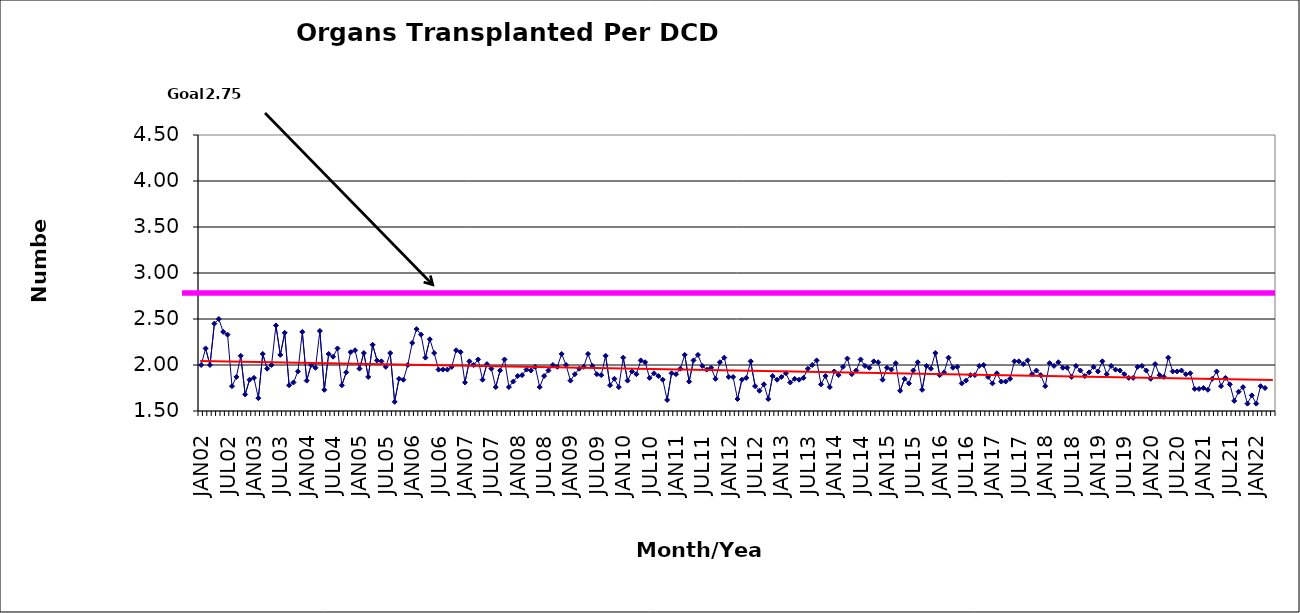
| Category | Series 0 |
|---|---|
| JAN02 | 2 |
| FEB02 | 2.18 |
| MAR02 | 2 |
| APR02 | 2.45 |
| MAY02 | 2.5 |
| JUN02 | 2.36 |
| JUL02 | 2.33 |
| AUG02 | 1.77 |
| SEP02 | 1.87 |
| OCT02 | 2.1 |
| NOV02 | 1.68 |
| DEC02 | 1.84 |
| JAN03 | 1.86 |
| FEB03 | 1.64 |
| MAR03 | 2.12 |
| APR03 | 1.96 |
| MAY03 | 2 |
| JUN03 | 2.43 |
| JUL03 | 2.11 |
| AUG03 | 2.35 |
| SEP03 | 1.78 |
| OCT03 | 1.81 |
| NOV03 | 1.93 |
| DEC03 | 2.36 |
| JAN04 | 1.83 |
| FEB04 | 2 |
| MAR04 | 1.97 |
| APR04 | 2.37 |
| MAY04 | 1.73 |
| JUN04 | 2.12 |
| JUL04 | 2.09 |
| AUG04 | 2.18 |
| SEP04 | 1.78 |
| OCT04 | 1.92 |
| NOV04 | 2.14 |
| DEC04 | 2.16 |
| JAN05 | 1.96 |
| FEB05 | 2.13 |
| MAR05 | 1.87 |
| APR05 | 2.22 |
| MAY05 | 2.05 |
| JUN05 | 2.04 |
| JUL05 | 1.98 |
| AUG05 | 2.13 |
| SEP05 | 1.6 |
| OCT05 | 1.85 |
| NOV05 | 1.84 |
| DEC05 | 2 |
| JAN06 | 2.24 |
| FEB06 | 2.39 |
| MAR06 | 2.33 |
| APR06 | 2.08 |
| MAY06 | 2.28 |
| JUN06 | 2.13 |
| JUL06 | 1.95 |
| AUG06 | 1.95 |
| SEP06 | 1.95 |
| OCT06 | 1.98 |
| NOV06 | 2.16 |
| DEC06 | 2.14 |
| JAN07 | 1.81 |
| FEB07 | 2.04 |
| MAR07 | 2 |
| APR07 | 2.06 |
| MAY07 | 1.84 |
| JUN07 | 2.01 |
| JUL07 | 1.96 |
| AUG07 | 1.76 |
| SEP07 | 1.94 |
| OCT07 | 2.06 |
| NOV07 | 1.76 |
| DEC07 | 1.82 |
| JAN08 | 1.88 |
| FEB08 | 1.89 |
| MAR08 | 1.95 |
| APR08 | 1.94 |
| MAY08 | 1.98 |
| JUN08 | 1.76 |
| JUL08 | 1.88 |
| AUG08 | 1.94 |
| SEP08 | 2 |
| OCT08 | 1.98 |
| NOV08 | 2.12 |
| DEC08 | 2 |
| JAN09 | 1.83 |
| FEB09 | 1.9 |
| MAR09 | 1.96 |
| APR09 | 1.98 |
| MAY09 | 2.12 |
| JUN09 | 1.99 |
| JUL09 | 1.9 |
| AUG09 | 1.89 |
| SEP09 | 2.1 |
| OCT09 | 1.78 |
| NOV09 | 1.85 |
| DEC09 | 1.76 |
| JAN10 | 2.08 |
| FEB10 | 1.83 |
| MAR10 | 1.93 |
| APR10 | 1.9 |
| MAY10 | 2.05 |
| JUN10 | 2.03 |
| JUL10 | 1.86 |
| AUG10 | 1.91 |
| SEP10 | 1.88 |
| OCT10 | 1.84 |
| NOV10 | 1.62 |
| DEC10 | 1.91 |
| JAN11 | 1.9 |
| FEB11 | 1.96 |
| MAR11 | 2.11 |
| APR11 | 1.82 |
| MAY11 | 2.05 |
| JUN11 | 2.11 |
| JUL11 | 1.99 |
| AUG11 | 1.95 |
| SEP11 | 1.97 |
| OCT11 | 1.85 |
| NOV11 | 2.03 |
| DEC11 | 2.08 |
| JAN12 | 1.87 |
| FEB12 | 1.87 |
| MAR12 | 1.63 |
| APR12 | 1.84 |
| MAY12 | 1.86 |
| JUN12 | 2.04 |
| JUL12 | 1.77 |
| AUG12 | 1.72 |
| SEP12 | 1.79 |
| OCT12 | 1.63 |
| NOV12 | 1.88 |
| DEC12 | 1.84 |
| JAN13 | 1.87 |
| FEB13 | 1.91 |
| MAR13 | 1.81 |
| APR13 | 1.85 |
| MAY13 | 1.84 |
| JUN13 | 1.86 |
| JUL13 | 1.96 |
| AUG13 | 2 |
| SEP13 | 2.05 |
| OCT13 | 1.79 |
| NOV13 | 1.88 |
| DEC13 | 1.76 |
| JAN14 | 1.93 |
| FEB14 | 1.89 |
| MAR14 | 1.98 |
| APR14 | 2.07 |
| MAY14 | 1.9 |
| JUN14 | 1.94 |
| JUL14 | 2.06 |
| AUG14 | 1.99 |
| SEP14 | 1.97 |
| OCT14 | 2.04 |
| NOV14 | 2.03 |
| DEC14 | 1.84 |
| JAN15 | 1.97 |
| FEB15 | 1.95 |
| MAR15 | 2.02 |
| APR15 | 1.72 |
| MAY15 | 1.85 |
| JUN15 | 1.8 |
| JUL15 | 1.94 |
| AUG15 | 2.03 |
| SEP15 | 1.73 |
| OCT15 | 1.99 |
| NOV15 | 1.96 |
| DEC15 | 2.13 |
| JAN16 | 1.89 |
| FEB16 | 1.92 |
| MAR16 | 2.08 |
| APR16 | 1.97 |
| MAY16 | 1.98 |
| JUN16 | 1.8 |
| JUL16 | 1.83 |
| AUG16 | 1.89 |
| SEP16 | 1.89 |
| OCT16 | 1.99 |
| NOV16 | 2 |
| DEC16 | 1.87 |
| JAN17 | 1.8 |
| FEB17 | 1.91 |
| MAR17 | 1.82 |
| APR17 | 1.82 |
| MAY17 | 1.85 |
| JUN17 | 2.04 |
| JUL17 | 2.04 |
| AUG17 | 2.01 |
| SEP17 | 2.05 |
| OCT17 | 1.9 |
| NOV17 | 1.94 |
| DEC17 | 1.89 |
| JAN18 | 1.77 |
| FEB18 | 2.02 |
| MAR18 | 1.99 |
| APR18 | 2.03 |
| MAY18 | 1.97 |
| JUN18 | 1.97 |
| JUL18 | 1.87 |
| AUG18 | 1.99 |
| SEP18 | 1.94 |
| OCT18 | 1.88 |
| NOV18 | 1.92 |
| DEC18 | 1.98 |
| JAN19 | 1.93 |
| FEB19 | 2.04 |
| MAR19 | 1.9 |
| APR19 | 1.99 |
| MAY19 | 1.95 |
| JUN19 | 1.94 |
| JUL19 | 1.9 |
| AUG19 | 1.86 |
| SEP19 | 1.86 |
| OCT19 | 1.98 |
| NOV19 | 1.99 |
| DEC19 | 1.94 |
| JAN20 | 1.85 |
| FEB20 | 2.01 |
| MAR20 | 1.89 |
| APR20 | 1.87 |
| MAY20 | 2.08 |
| JUN20 | 1.93 |
| JUL20 | 1.93 |
| AUG20 | 1.94 |
| SEP20 | 1.9 |
| OCT20 | 1.91 |
| NOV20 | 1.74 |
| DEC20 | 1.74 |
| JAN21 | 1.75 |
| FEB21 | 1.73 |
| MAR21 | 1.85 |
| APR21 | 1.93 |
| MAY21 | 1.77 |
| JUN21 | 1.86 |
| JUL21 | 1.79 |
| AUG21 | 1.61 |
| SEP21 | 1.71 |
| OCT21 | 1.76 |
| NOV21 | 1.58 |
| DEC21 | 1.67 |
| JAN22 | 1.58 |
| FEB22 | 1.77 |
| MAR22 | 1.75 |